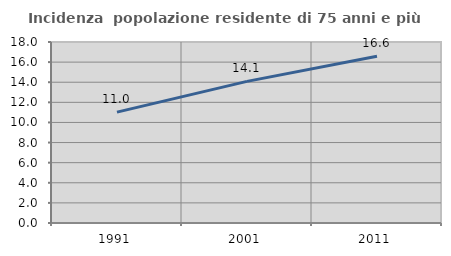
| Category | Incidenza  popolazione residente di 75 anni e più |
|---|---|
| 1991.0 | 11.024 |
| 2001.0 | 14.085 |
| 2011.0 | 16.58 |